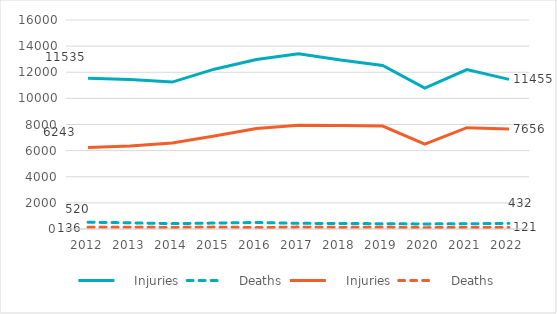
| Category |     Injuries |    Deaths |
|---|---|---|
| 2012 | 6243 | 136 |
| 2013 | 6362 | 134 |
| 2014 | 6579 | 118 |
| 2015 | 7119 | 145 |
| 2016 | 7692 | 108 |
| 2017 | 7939 | 146 |
| 2018 | 7921 | 123 |
| 2019 | 7881 | 130 |
| 2020 | 6501 | 104 |
| 2021 | 7757 | 117 |
| 2022 | 7656 | 121 |